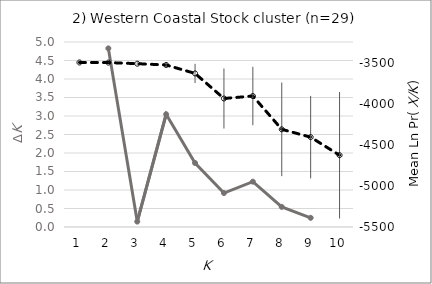
| Category | Evanno's ΔK |
|---|---|
| 0 | 0 |
| 1 | 4.828 |
| 2 | 0.146 |
| 3 | 3.048 |
| 4 | 1.73 |
| 5 | 0.918 |
| 6 | 1.226 |
| 7 | 0.544 |
| 8 | 0.248 |
| 9 | 0 |